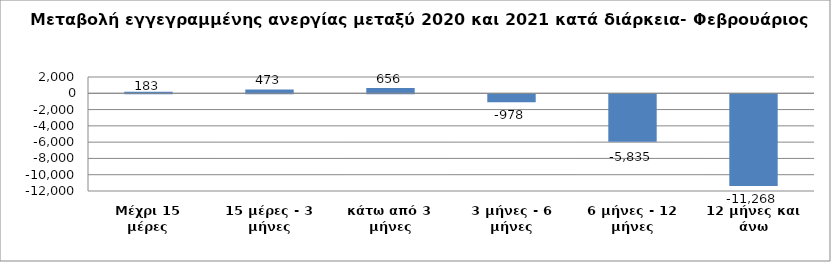
| Category | Series 0 |
|---|---|
| Μέχρι 15 μέρες | 183 |
| 15 μέρες - 3 μήνες | 473 |
| κάτω από 3 μήνες | 656 |
| 3 μήνες - 6 μήνες | -978 |
| 6 μήνες - 12 μήνες | -5835 |
| 12 μήνες και άνω | -11268 |